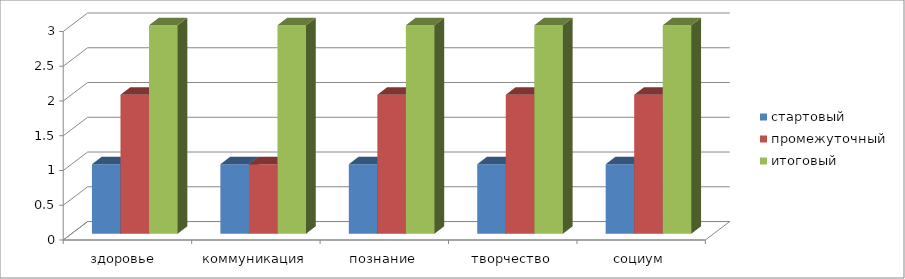
| Category | стартовый | промежуточный | итоговый |
|---|---|---|---|
| здоровье  | 1 | 2 | 3 |
| коммуникация | 1 | 1 | 3 |
| познание | 1 | 2 | 3 |
| творчество | 1 | 2 | 3 |
| социум | 1 | 2 | 3 |